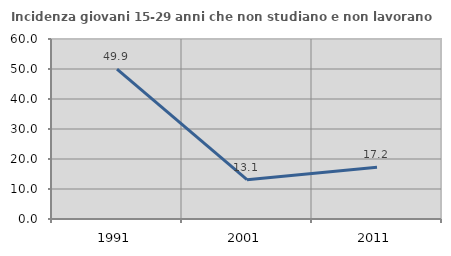
| Category | Incidenza giovani 15-29 anni che non studiano e non lavorano  |
|---|---|
| 1991.0 | 49.93 |
| 2001.0 | 13.102 |
| 2011.0 | 17.219 |